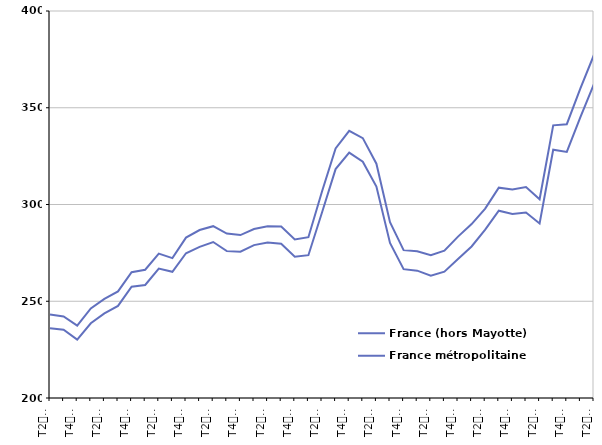
| Category | France (hors Mayotte) | France métropolitaine |
|---|---|---|
| T2
2011 | 243.1 | 236.1 |
| T3
2011 | 242.1 | 235.3 |
| T4
2011 | 237.4 | 230.2 |
| T1
2012 | 246.3 | 238.6 |
| T2
2012 | 251.2 | 243.7 |
| T3
2012 | 255.1 | 247.6 |
| T4
2012 | 265 | 257.5 |
| T1
2013 | 266.3 | 258.4 |
| T2
2013 | 274.6 | 266.9 |
| T3
2013 | 272.3 | 265.2 |
| T4
2013 | 282.9 | 274.8 |
| T1
2014 | 286.8 | 278.1 |
| T2
2014 | 288.8 | 280.6 |
| T3
2014 | 285 | 275.9 |
| T4
2014 | 284.2 | 275.6 |
| T1
2015 | 287.3 | 279 |
| T2
2015 | 288.7 | 280.3 |
| T3
2015 | 288.6 | 279.7 |
| T4
2015 | 281.9 | 273 |
| T1
2016 | 283.1 | 273.8 |
| T2
2016 | 306.7 | 295.9 |
| T3
2016 | 329 | 318.3 |
| T4
2016 | 338.1 | 326.8 |
| T1
2017 | 334.3 | 322.1 |
| T2
2017 | 321.1 | 309.3 |
| T3
2017 | 290.9 | 280.1 |
| T4
2017 | 276.4 | 266.6 |
| T1
2018 | 275.8 | 265.8 |
| T2
2018 | 273.8 | 263.2 |
| T3
2018 | 276.1 | 265.3 |
| T4
2018 | 283.4 | 271.8 |
| T1
2019 | 289.9 | 278.3 |
| T2
2019 | 297.9 | 287 |
| T3
2019 | 308.7 | 296.8 |
| T4
2019 | 307.8 | 295.1 |
| T1
2020 | 309 | 295.9 |
| T2
2020 | 302.7 | 290.2 |
| T3
2020 | 340.9 | 328.3 |
| T4
2020 | 341.5 | 327.2 |
| T1
2021 | 360 | 345.2 |
| T2
2021 | 377.4 | 362.3 |